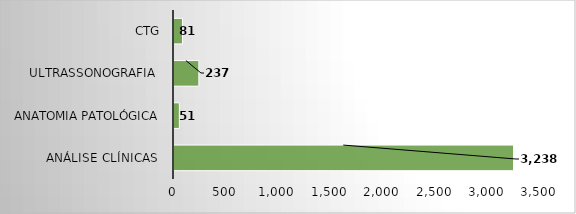
| Category | Series 0 |
|---|---|
| Análise Clínicas  | 3238 |
| Anatomia Patológica | 51 |
| Ultrassonografia  | 237 |
| CTG | 81 |